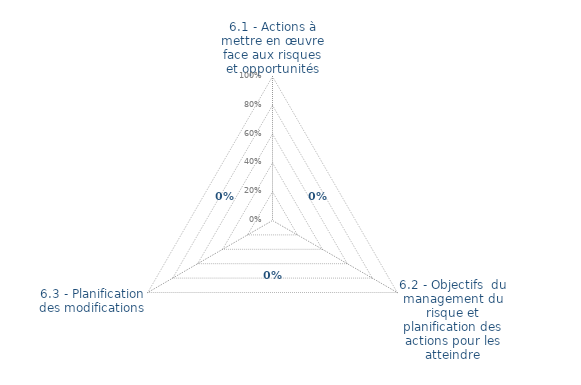
| Category | Art. 6 | limite de CONFORMITÉ |
|---|---|---|
| 6.1 - Actions à mettre en œuvre face aux risques et opportunités | 0 | 0 |
| 6.2 - Objectifs  du management du risque et planification des actions pour les atteindre | 0 | 0 |
| 6.3 - Planification des modifications | 0 | 0 |